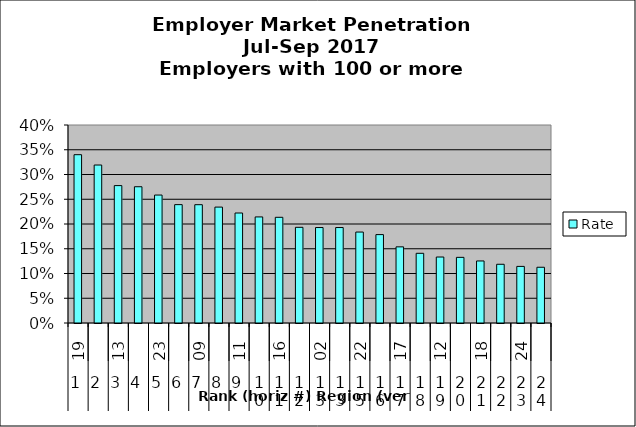
| Category | Rate |
|---|---|
| 0 | 0.34 |
| 1 | 0.319 |
| 2 | 0.278 |
| 3 | 0.275 |
| 4 | 0.258 |
| 5 | 0.239 |
| 6 | 0.239 |
| 7 | 0.234 |
| 8 | 0.222 |
| 9 | 0.214 |
| 10 | 0.214 |
| 11 | 0.193 |
| 12 | 0.193 |
| 13 | 0.193 |
| 14 | 0.184 |
| 15 | 0.179 |
| 16 | 0.154 |
| 17 | 0.141 |
| 18 | 0.133 |
| 19 | 0.133 |
| 20 | 0.125 |
| 21 | 0.119 |
| 22 | 0.114 |
| 23 | 0.113 |